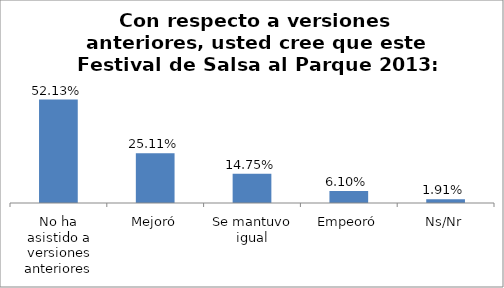
| Category | Total |
|---|---|
| No ha asistido a versiones anteriores | 0.521 |
| Mejoró | 0.251 |
| Se mantuvo igual | 0.147 |
| Empeoró | 0.061 |
| Ns/Nr | 0.019 |